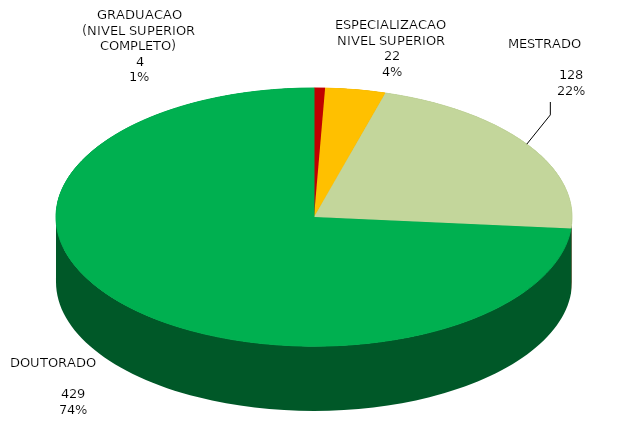
| Category | Total Geral |
|---|---|
| GRADUACAO (NIVEL SUPERIOR COMPLETO) | 4 |
| ESPECIALIZACAO NIVEL SUPERIOR | 22 |
| MESTRADO                              | 128 |
| DOUTORADO                             | 429 |